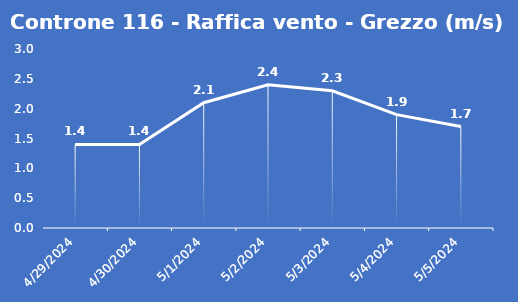
| Category | Controne 116 - Raffica vento - Grezzo (m/s) |
|---|---|
| 4/29/24 | 1.4 |
| 4/30/24 | 1.4 |
| 5/1/24 | 2.1 |
| 5/2/24 | 2.4 |
| 5/3/24 | 2.3 |
| 5/4/24 | 1.9 |
| 5/5/24 | 1.7 |